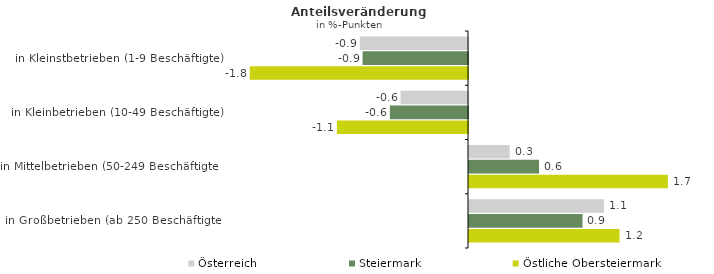
| Category | Österreich | Steiermark | Östliche Obersteiermark |
|---|---|---|---|
| in Kleinstbetrieben (1-9 Beschäftigte) | -0.898 | -0.875 | -1.811 |
| in Kleinbetrieben (10-49 Beschäftigte) | -0.559 | -0.648 | -1.088 |
| in Mittelbetrieben (50-249 Beschäftigte) | 0.338 | 0.581 | 1.65 |
| in Großbetrieben (ab 250 Beschäftigte) | 1.12 | 0.942 | 1.249 |